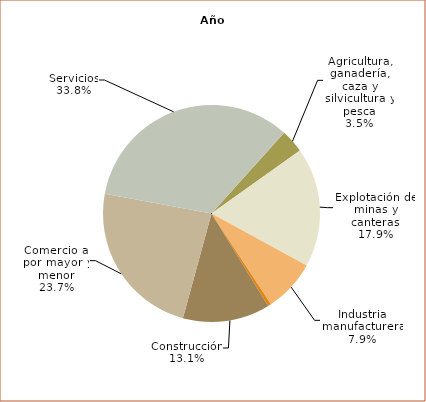
| Category | 2022 |
|---|---|
| Agricultura, ganadería, caza y silvicultura y pesca | 1480760 |
| Explotación de minas y canteras | 7563250 |
| Industria manufacturera | 3313237 |
| Electricidad, gas y agua | 195839 |
| Construcción | 5520974 |
| Comercio al por mayor y menor | 10045105 |
| Servicios | 14326945 |